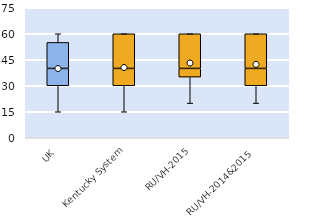
| Category | 25th | 50th | 75th |
|---|---|---|---|
| UK | 30 | 10 | 15 |
| Kentucky System | 30 | 10 | 20 |
| RU/VH-2015 | 35 | 5 | 20 |
| RU/VH-2014&2015 | 30 | 10 | 20 |